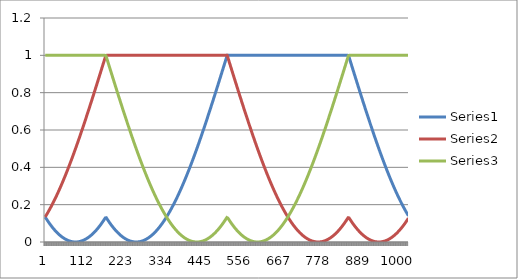
| Category | Series 0 | Series 1 | Series 2 |
|---|---|---|---|
| 0 | 0.134 | 0.134 | 1 |
| 1 | 0.131 | 0.137 | 1 |
| 2 | 0.128 | 0.14 | 1 |
| 3 | 0.125 | 0.143 | 1 |
| 4 | 0.122 | 0.147 | 1 |
| 5 | 0.119 | 0.15 | 1 |
| 6 | 0.116 | 0.153 | 1 |
| 7 | 0.113 | 0.156 | 1 |
| 8 | 0.111 | 0.16 | 1 |
| 9 | 0.108 | 0.163 | 1 |
| 10 | 0.105 | 0.166 | 1 |
| 11 | 0.102 | 0.17 | 1 |
| 12 | 0.1 | 0.173 | 1 |
| 13 | 0.097 | 0.177 | 1 |
| 14 | 0.094 | 0.18 | 1 |
| 15 | 0.092 | 0.184 | 1 |
| 16 | 0.089 | 0.187 | 1 |
| 17 | 0.087 | 0.191 | 1 |
| 18 | 0.084 | 0.194 | 1 |
| 19 | 0.082 | 0.198 | 1 |
| 20 | 0.079 | 0.202 | 1 |
| 21 | 0.077 | 0.205 | 1 |
| 22 | 0.075 | 0.209 | 1 |
| 23 | 0.072 | 0.213 | 1 |
| 24 | 0.07 | 0.217 | 1 |
| 25 | 0.068 | 0.221 | 1 |
| 26 | 0.066 | 0.224 | 1 |
| 27 | 0.063 | 0.228 | 1 |
| 28 | 0.061 | 0.232 | 1 |
| 29 | 0.059 | 0.236 | 1 |
| 30 | 0.057 | 0.24 | 1 |
| 31 | 0.055 | 0.244 | 1 |
| 32 | 0.053 | 0.248 | 1 |
| 33 | 0.051 | 0.252 | 1 |
| 34 | 0.049 | 0.256 | 1 |
| 35 | 0.047 | 0.26 | 1 |
| 36 | 0.045 | 0.265 | 1 |
| 37 | 0.044 | 0.269 | 1 |
| 38 | 0.042 | 0.273 | 1 |
| 39 | 0.04 | 0.277 | 1 |
| 40 | 0.038 | 0.281 | 1 |
| 41 | 0.037 | 0.286 | 1 |
| 42 | 0.035 | 0.29 | 1 |
| 43 | 0.034 | 0.294 | 1 |
| 44 | 0.032 | 0.299 | 1 |
| 45 | 0.03 | 0.303 | 1 |
| 46 | 0.029 | 0.308 | 1 |
| 47 | 0.028 | 0.312 | 1 |
| 48 | 0.026 | 0.316 | 1 |
| 49 | 0.025 | 0.321 | 1 |
| 50 | 0.023 | 0.325 | 1 |
| 51 | 0.022 | 0.33 | 1 |
| 52 | 0.021 | 0.335 | 1 |
| 53 | 0.02 | 0.339 | 1 |
| 54 | 0.018 | 0.344 | 1 |
| 55 | 0.017 | 0.348 | 1 |
| 56 | 0.016 | 0.353 | 1 |
| 57 | 0.015 | 0.358 | 1 |
| 58 | 0.014 | 0.362 | 1 |
| 59 | 0.013 | 0.367 | 1 |
| 60 | 0.012 | 0.372 | 1 |
| 61 | 0.011 | 0.377 | 1 |
| 62 | 0.01 | 0.382 | 1 |
| 63 | 0.009 | 0.386 | 1 |
| 64 | 0.009 | 0.391 | 1 |
| 65 | 0.008 | 0.396 | 1 |
| 66 | 0.007 | 0.401 | 1 |
| 67 | 0.006 | 0.406 | 1 |
| 68 | 0.006 | 0.411 | 1 |
| 69 | 0.005 | 0.416 | 1 |
| 70 | 0.004 | 0.421 | 1 |
| 71 | 0.004 | 0.426 | 1 |
| 72 | 0.003 | 0.431 | 1 |
| 73 | 0.003 | 0.436 | 1 |
| 74 | 0.002 | 0.441 | 1 |
| 75 | 0.002 | 0.446 | 1 |
| 76 | 0.002 | 0.451 | 1 |
| 77 | 0.001 | 0.456 | 1 |
| 78 | 0.001 | 0.462 | 1 |
| 79 | 0.001 | 0.467 | 1 |
| 80 | 0.001 | 0.472 | 1 |
| 81 | 0 | 0.477 | 1 |
| 82 | 0 | 0.482 | 1 |
| 83 | 0 | 0.488 | 1 |
| 84 | 0 | 0.493 | 1 |
| 85 | 0 | 0.498 | 1 |
| 86 | 0 | 0.504 | 1 |
| 87 | 0 | 0.509 | 1 |
| 88 | 0 | 0.514 | 1 |
| 89 | 0 | 0.52 | 1 |
| 90 | 0 | 0.525 | 1 |
| 91 | 0.001 | 0.53 | 1 |
| 92 | 0.001 | 0.536 | 1 |
| 93 | 0.001 | 0.541 | 1 |
| 94 | 0.001 | 0.547 | 1 |
| 95 | 0.002 | 0.552 | 1 |
| 96 | 0.002 | 0.558 | 1 |
| 97 | 0.003 | 0.563 | 1 |
| 98 | 0.003 | 0.569 | 1 |
| 99 | 0.004 | 0.574 | 1 |
| 100 | 0.004 | 0.58 | 1 |
| 101 | 0.005 | 0.585 | 1 |
| 102 | 0.005 | 0.591 | 1 |
| 103 | 0.006 | 0.597 | 1 |
| 104 | 0.007 | 0.602 | 1 |
| 105 | 0.007 | 0.608 | 1 |
| 106 | 0.008 | 0.614 | 1 |
| 107 | 0.009 | 0.619 | 1 |
| 108 | 0.01 | 0.625 | 1 |
| 109 | 0.011 | 0.631 | 1 |
| 110 | 0.011 | 0.636 | 1 |
| 111 | 0.012 | 0.642 | 1 |
| 112 | 0.013 | 0.648 | 1 |
| 113 | 0.014 | 0.654 | 1 |
| 114 | 0.015 | 0.659 | 1 |
| 115 | 0.017 | 0.665 | 1 |
| 116 | 0.018 | 0.671 | 1 |
| 117 | 0.019 | 0.677 | 1 |
| 118 | 0.02 | 0.682 | 1 |
| 119 | 0.021 | 0.688 | 1 |
| 120 | 0.023 | 0.694 | 1 |
| 121 | 0.024 | 0.7 | 1 |
| 122 | 0.025 | 0.706 | 1 |
| 123 | 0.027 | 0.712 | 1 |
| 124 | 0.028 | 0.718 | 1 |
| 125 | 0.03 | 0.723 | 1 |
| 126 | 0.031 | 0.729 | 1 |
| 127 | 0.033 | 0.735 | 1 |
| 128 | 0.034 | 0.741 | 1 |
| 129 | 0.036 | 0.747 | 1 |
| 130 | 0.037 | 0.753 | 1 |
| 131 | 0.039 | 0.759 | 1 |
| 132 | 0.041 | 0.765 | 1 |
| 133 | 0.042 | 0.771 | 1 |
| 134 | 0.044 | 0.777 | 1 |
| 135 | 0.046 | 0.783 | 1 |
| 136 | 0.048 | 0.789 | 1 |
| 137 | 0.05 | 0.795 | 1 |
| 138 | 0.052 | 0.801 | 1 |
| 139 | 0.054 | 0.807 | 1 |
| 140 | 0.056 | 0.813 | 1 |
| 141 | 0.058 | 0.819 | 1 |
| 142 | 0.06 | 0.825 | 1 |
| 143 | 0.062 | 0.831 | 1 |
| 144 | 0.064 | 0.837 | 1 |
| 145 | 0.066 | 0.843 | 1 |
| 146 | 0.069 | 0.849 | 1 |
| 147 | 0.071 | 0.855 | 1 |
| 148 | 0.073 | 0.861 | 1 |
| 149 | 0.075 | 0.867 | 1 |
| 150 | 0.078 | 0.874 | 1 |
| 151 | 0.08 | 0.88 | 1 |
| 152 | 0.083 | 0.886 | 1 |
| 153 | 0.085 | 0.892 | 1 |
| 154 | 0.087 | 0.898 | 1 |
| 155 | 0.09 | 0.904 | 1 |
| 156 | 0.093 | 0.91 | 1 |
| 157 | 0.095 | 0.916 | 1 |
| 158 | 0.098 | 0.922 | 1 |
| 159 | 0.1 | 0.928 | 1 |
| 160 | 0.103 | 0.935 | 1 |
| 161 | 0.106 | 0.941 | 1 |
| 162 | 0.109 | 0.947 | 1 |
| 163 | 0.111 | 0.953 | 1 |
| 164 | 0.114 | 0.959 | 1 |
| 165 | 0.117 | 0.965 | 1 |
| 166 | 0.12 | 0.971 | 1 |
| 167 | 0.123 | 0.978 | 1 |
| 168 | 0.126 | 0.984 | 1 |
| 169 | 0.129 | 0.99 | 1 |
| 170 | 0.132 | 0.996 | 1 |
| 171 | 0.133 | 1 | 0.998 |
| 172 | 0.13 | 1 | 0.992 |
| 173 | 0.127 | 1 | 0.986 |
| 174 | 0.124 | 1 | 0.98 |
| 175 | 0.121 | 1 | 0.973 |
| 176 | 0.118 | 1 | 0.967 |
| 177 | 0.115 | 1 | 0.961 |
| 178 | 0.112 | 1 | 0.955 |
| 179 | 0.11 | 1 | 0.949 |
| 180 | 0.107 | 1 | 0.943 |
| 181 | 0.104 | 1 | 0.937 |
| 182 | 0.101 | 1 | 0.931 |
| 183 | 0.099 | 1 | 0.924 |
| 184 | 0.096 | 1 | 0.918 |
| 185 | 0.093 | 1 | 0.912 |
| 186 | 0.091 | 1 | 0.906 |
| 187 | 0.088 | 1 | 0.9 |
| 188 | 0.086 | 1 | 0.894 |
| 189 | 0.083 | 1 | 0.888 |
| 190 | 0.081 | 1 | 0.882 |
| 191 | 0.079 | 1 | 0.876 |
| 192 | 0.076 | 1 | 0.869 |
| 193 | 0.074 | 1 | 0.863 |
| 194 | 0.072 | 1 | 0.857 |
| 195 | 0.069 | 1 | 0.851 |
| 196 | 0.067 | 1 | 0.845 |
| 197 | 0.065 | 1 | 0.839 |
| 198 | 0.063 | 1 | 0.833 |
| 199 | 0.061 | 1 | 0.827 |
| 200 | 0.058 | 1 | 0.821 |
| 201 | 0.056 | 1 | 0.815 |
| 202 | 0.054 | 1 | 0.809 |
| 203 | 0.052 | 1 | 0.803 |
| 204 | 0.05 | 1 | 0.797 |
| 205 | 0.049 | 1 | 0.791 |
| 206 | 0.047 | 1 | 0.785 |
| 207 | 0.045 | 1 | 0.779 |
| 208 | 0.043 | 1 | 0.773 |
| 209 | 0.041 | 1 | 0.767 |
| 210 | 0.04 | 1 | 0.761 |
| 211 | 0.038 | 1 | 0.755 |
| 212 | 0.036 | 1 | 0.749 |
| 213 | 0.035 | 1 | 0.743 |
| 214 | 0.033 | 1 | 0.737 |
| 215 | 0.032 | 1 | 0.731 |
| 216 | 0.03 | 1 | 0.725 |
| 217 | 0.029 | 1 | 0.72 |
| 218 | 0.027 | 1 | 0.714 |
| 219 | 0.026 | 1 | 0.708 |
| 220 | 0.024 | 1 | 0.702 |
| 221 | 0.023 | 1 | 0.696 |
| 222 | 0.022 | 1 | 0.69 |
| 223 | 0.02 | 1 | 0.684 |
| 224 | 0.019 | 1 | 0.679 |
| 225 | 0.018 | 1 | 0.673 |
| 226 | 0.017 | 1 | 0.667 |
| 227 | 0.016 | 1 | 0.661 |
| 228 | 0.015 | 1 | 0.655 |
| 229 | 0.014 | 1 | 0.65 |
| 230 | 0.013 | 1 | 0.644 |
| 231 | 0.012 | 1 | 0.638 |
| 232 | 0.011 | 1 | 0.632 |
| 233 | 0.01 | 1 | 0.627 |
| 234 | 0.009 | 1 | 0.621 |
| 235 | 0.008 | 1 | 0.615 |
| 236 | 0.008 | 1 | 0.61 |
| 237 | 0.007 | 1 | 0.604 |
| 238 | 0.006 | 1 | 0.599 |
| 239 | 0.005 | 1 | 0.593 |
| 240 | 0.005 | 1 | 0.587 |
| 241 | 0.004 | 1 | 0.582 |
| 242 | 0.004 | 1 | 0.576 |
| 243 | 0.003 | 1 | 0.571 |
| 244 | 0.003 | 1 | 0.565 |
| 245 | 0.002 | 1 | 0.56 |
| 246 | 0.002 | 1 | 0.554 |
| 247 | 0.002 | 1 | 0.549 |
| 248 | 0.001 | 1 | 0.543 |
| 249 | 0.001 | 1 | 0.538 |
| 250 | 0.001 | 1 | 0.532 |
| 251 | 0 | 1 | 0.527 |
| 252 | 0 | 1 | 0.521 |
| 253 | 0 | 1 | 0.516 |
| 254 | 0 | 1 | 0.511 |
| 255 | 0 | 1 | 0.505 |
| 256 | 0 | 1 | 0.5 |
| 257 | 0 | 1 | 0.495 |
| 258 | 0 | 1 | 0.489 |
| 259 | 0 | 1 | 0.484 |
| 260 | 0 | 1 | 0.479 |
| 261 | 0 | 1 | 0.474 |
| 262 | 0.001 | 1 | 0.468 |
| 263 | 0.001 | 1 | 0.463 |
| 264 | 0.001 | 1 | 0.458 |
| 265 | 0.002 | 1 | 0.453 |
| 266 | 0.002 | 1 | 0.448 |
| 267 | 0.002 | 1 | 0.443 |
| 268 | 0.003 | 1 | 0.438 |
| 269 | 0.003 | 1 | 0.433 |
| 270 | 0.004 | 1 | 0.428 |
| 271 | 0.004 | 1 | 0.423 |
| 272 | 0.005 | 1 | 0.418 |
| 273 | 0.005 | 1 | 0.413 |
| 274 | 0.006 | 1 | 0.408 |
| 275 | 0.007 | 1 | 0.403 |
| 276 | 0.008 | 1 | 0.398 |
| 277 | 0.008 | 1 | 0.393 |
| 278 | 0.009 | 1 | 0.388 |
| 279 | 0.01 | 1 | 0.383 |
| 280 | 0.011 | 1 | 0.378 |
| 281 | 0.012 | 1 | 0.374 |
| 282 | 0.013 | 1 | 0.369 |
| 283 | 0.014 | 1 | 0.364 |
| 284 | 0.015 | 1 | 0.359 |
| 285 | 0.016 | 1 | 0.355 |
| 286 | 0.017 | 1 | 0.35 |
| 287 | 0.018 | 1 | 0.345 |
| 288 | 0.019 | 1 | 0.341 |
| 289 | 0.02 | 1 | 0.336 |
| 290 | 0.022 | 1 | 0.331 |
| 291 | 0.023 | 1 | 0.327 |
| 292 | 0.024 | 1 | 0.322 |
| 293 | 0.026 | 1 | 0.318 |
| 294 | 0.027 | 1 | 0.313 |
| 295 | 0.029 | 1 | 0.309 |
| 296 | 0.03 | 1 | 0.305 |
| 297 | 0.032 | 1 | 0.3 |
| 298 | 0.033 | 1 | 0.296 |
| 299 | 0.035 | 1 | 0.291 |
| 300 | 0.036 | 1 | 0.287 |
| 301 | 0.038 | 1 | 0.283 |
| 302 | 0.04 | 1 | 0.279 |
| 303 | 0.041 | 1 | 0.274 |
| 304 | 0.043 | 1 | 0.27 |
| 305 | 0.045 | 1 | 0.266 |
| 306 | 0.047 | 1 | 0.262 |
| 307 | 0.049 | 1 | 0.258 |
| 308 | 0.05 | 1 | 0.254 |
| 309 | 0.052 | 1 | 0.25 |
| 310 | 0.054 | 1 | 0.245 |
| 311 | 0.056 | 1 | 0.241 |
| 312 | 0.058 | 1 | 0.237 |
| 313 | 0.061 | 1 | 0.234 |
| 314 | 0.063 | 1 | 0.23 |
| 315 | 0.065 | 1 | 0.226 |
| 316 | 0.067 | 1 | 0.222 |
| 317 | 0.069 | 1 | 0.218 |
| 318 | 0.072 | 1 | 0.214 |
| 319 | 0.074 | 1 | 0.21 |
| 320 | 0.076 | 1 | 0.207 |
| 321 | 0.079 | 1 | 0.203 |
| 322 | 0.081 | 1 | 0.199 |
| 323 | 0.083 | 1 | 0.196 |
| 324 | 0.086 | 1 | 0.192 |
| 325 | 0.088 | 1 | 0.188 |
| 326 | 0.091 | 1 | 0.185 |
| 327 | 0.093 | 1 | 0.181 |
| 328 | 0.096 | 1 | 0.178 |
| 329 | 0.099 | 1 | 0.174 |
| 330 | 0.101 | 1 | 0.171 |
| 331 | 0.104 | 1 | 0.167 |
| 332 | 0.107 | 1 | 0.164 |
| 333 | 0.11 | 1 | 0.161 |
| 334 | 0.112 | 1 | 0.157 |
| 335 | 0.115 | 1 | 0.154 |
| 336 | 0.118 | 1 | 0.151 |
| 337 | 0.121 | 1 | 0.148 |
| 338 | 0.124 | 1 | 0.144 |
| 339 | 0.127 | 1 | 0.141 |
| 340 | 0.13 | 1 | 0.138 |
| 341 | 0.133 | 1 | 0.135 |
| 342 | 0.136 | 1 | 0.132 |
| 343 | 0.139 | 1 | 0.129 |
| 344 | 0.142 | 1 | 0.126 |
| 345 | 0.145 | 1 | 0.123 |
| 346 | 0.149 | 1 | 0.12 |
| 347 | 0.152 | 1 | 0.117 |
| 348 | 0.155 | 1 | 0.114 |
| 349 | 0.158 | 1 | 0.111 |
| 350 | 0.162 | 1 | 0.109 |
| 351 | 0.165 | 1 | 0.106 |
| 352 | 0.169 | 1 | 0.103 |
| 353 | 0.172 | 1 | 0.1 |
| 354 | 0.175 | 1 | 0.098 |
| 355 | 0.179 | 1 | 0.095 |
| 356 | 0.182 | 1 | 0.093 |
| 357 | 0.186 | 1 | 0.09 |
| 358 | 0.19 | 1 | 0.087 |
| 359 | 0.193 | 1 | 0.085 |
| 360 | 0.197 | 1 | 0.083 |
| 361 | 0.2 | 1 | 0.08 |
| 362 | 0.204 | 1 | 0.078 |
| 363 | 0.208 | 1 | 0.075 |
| 364 | 0.212 | 1 | 0.073 |
| 365 | 0.215 | 1 | 0.071 |
| 366 | 0.219 | 1 | 0.069 |
| 367 | 0.223 | 1 | 0.066 |
| 368 | 0.227 | 1 | 0.064 |
| 369 | 0.231 | 1 | 0.062 |
| 370 | 0.235 | 1 | 0.06 |
| 371 | 0.239 | 1 | 0.058 |
| 372 | 0.243 | 1 | 0.056 |
| 373 | 0.247 | 1 | 0.054 |
| 374 | 0.251 | 1 | 0.052 |
| 375 | 0.255 | 1 | 0.05 |
| 376 | 0.259 | 1 | 0.048 |
| 377 | 0.263 | 1 | 0.046 |
| 378 | 0.267 | 1 | 0.044 |
| 379 | 0.272 | 1 | 0.042 |
| 380 | 0.276 | 1 | 0.041 |
| 381 | 0.28 | 1 | 0.039 |
| 382 | 0.284 | 1 | 0.037 |
| 383 | 0.289 | 1 | 0.036 |
| 384 | 0.293 | 1 | 0.034 |
| 385 | 0.297 | 1 | 0.033 |
| 386 | 0.302 | 1 | 0.031 |
| 387 | 0.306 | 1 | 0.03 |
| 388 | 0.31 | 1 | 0.028 |
| 389 | 0.315 | 1 | 0.027 |
| 390 | 0.319 | 1 | 0.025 |
| 391 | 0.324 | 1 | 0.024 |
| 392 | 0.328 | 1 | 0.023 |
| 393 | 0.333 | 1 | 0.021 |
| 394 | 0.338 | 1 | 0.02 |
| 395 | 0.342 | 1 | 0.019 |
| 396 | 0.347 | 1 | 0.018 |
| 397 | 0.352 | 1 | 0.017 |
| 398 | 0.356 | 1 | 0.015 |
| 399 | 0.361 | 1 | 0.014 |
| 400 | 0.366 | 1 | 0.013 |
| 401 | 0.37 | 1 | 0.012 |
| 402 | 0.375 | 1 | 0.011 |
| 403 | 0.38 | 1 | 0.011 |
| 404 | 0.385 | 1 | 0.01 |
| 405 | 0.39 | 1 | 0.009 |
| 406 | 0.395 | 1 | 0.008 |
| 407 | 0.399 | 1 | 0.007 |
| 408 | 0.404 | 1 | 0.007 |
| 409 | 0.409 | 1 | 0.006 |
| 410 | 0.414 | 1 | 0.005 |
| 411 | 0.419 | 1 | 0.005 |
| 412 | 0.424 | 1 | 0.004 |
| 413 | 0.429 | 1 | 0.004 |
| 414 | 0.434 | 1 | 0.003 |
| 415 | 0.439 | 1 | 0.003 |
| 416 | 0.444 | 1 | 0.002 |
| 417 | 0.45 | 1 | 0.002 |
| 418 | 0.455 | 1 | 0.001 |
| 419 | 0.46 | 1 | 0.001 |
| 420 | 0.465 | 1 | 0.001 |
| 421 | 0.47 | 1 | 0.001 |
| 422 | 0.475 | 1 | 0 |
| 423 | 0.481 | 1 | 0 |
| 424 | 0.486 | 1 | 0 |
| 425 | 0.491 | 1 | 0 |
| 426 | 0.496 | 1 | 0 |
| 427 | 0.502 | 1 | 0 |
| 428 | 0.507 | 1 | 0 |
| 429 | 0.512 | 1 | 0 |
| 430 | 0.518 | 1 | 0 |
| 431 | 0.523 | 1 | 0 |
| 432 | 0.529 | 1 | 0.001 |
| 433 | 0.534 | 1 | 0.001 |
| 434 | 0.539 | 1 | 0.001 |
| 435 | 0.545 | 1 | 0.001 |
| 436 | 0.55 | 1 | 0.002 |
| 437 | 0.556 | 1 | 0.002 |
| 438 | 0.561 | 1 | 0.002 |
| 439 | 0.567 | 1 | 0.003 |
| 440 | 0.572 | 1 | 0.003 |
| 441 | 0.578 | 1 | 0.004 |
| 442 | 0.584 | 1 | 0.004 |
| 443 | 0.589 | 1 | 0.005 |
| 444 | 0.595 | 1 | 0.006 |
| 445 | 0.6 | 1 | 0.006 |
| 446 | 0.606 | 1 | 0.007 |
| 447 | 0.612 | 1 | 0.008 |
| 448 | 0.617 | 1 | 0.009 |
| 449 | 0.623 | 1 | 0.009 |
| 450 | 0.629 | 1 | 0.01 |
| 451 | 0.634 | 1 | 0.011 |
| 452 | 0.64 | 1 | 0.012 |
| 453 | 0.646 | 1 | 0.013 |
| 454 | 0.652 | 1 | 0.014 |
| 455 | 0.657 | 1 | 0.015 |
| 456 | 0.663 | 1 | 0.016 |
| 457 | 0.669 | 1 | 0.017 |
| 458 | 0.675 | 1 | 0.018 |
| 459 | 0.681 | 1 | 0.02 |
| 460 | 0.686 | 1 | 0.021 |
| 461 | 0.692 | 1 | 0.022 |
| 462 | 0.698 | 1 | 0.023 |
| 463 | 0.704 | 1 | 0.025 |
| 464 | 0.71 | 1 | 0.026 |
| 465 | 0.716 | 1 | 0.028 |
| 466 | 0.721 | 1 | 0.029 |
| 467 | 0.727 | 1 | 0.03 |
| 468 | 0.733 | 1 | 0.032 |
| 469 | 0.739 | 1 | 0.034 |
| 470 | 0.745 | 1 | 0.035 |
| 471 | 0.751 | 1 | 0.037 |
| 472 | 0.757 | 1 | 0.038 |
| 473 | 0.763 | 1 | 0.04 |
| 474 | 0.769 | 1 | 0.042 |
| 475 | 0.775 | 1 | 0.044 |
| 476 | 0.781 | 1 | 0.045 |
| 477 | 0.787 | 1 | 0.047 |
| 478 | 0.793 | 1 | 0.049 |
| 479 | 0.799 | 1 | 0.051 |
| 480 | 0.805 | 1 | 0.053 |
| 481 | 0.811 | 1 | 0.055 |
| 482 | 0.817 | 1 | 0.057 |
| 483 | 0.823 | 1 | 0.059 |
| 484 | 0.829 | 1 | 0.061 |
| 485 | 0.835 | 1 | 0.063 |
| 486 | 0.841 | 1 | 0.066 |
| 487 | 0.847 | 1 | 0.068 |
| 488 | 0.853 | 1 | 0.07 |
| 489 | 0.859 | 1 | 0.072 |
| 490 | 0.865 | 1 | 0.075 |
| 491 | 0.872 | 1 | 0.077 |
| 492 | 0.878 | 1 | 0.079 |
| 493 | 0.884 | 1 | 0.082 |
| 494 | 0.89 | 1 | 0.084 |
| 495 | 0.896 | 1 | 0.087 |
| 496 | 0.902 | 1 | 0.089 |
| 497 | 0.908 | 1 | 0.092 |
| 498 | 0.914 | 1 | 0.094 |
| 499 | 0.92 | 1 | 0.097 |
| 500 | 0.926 | 1 | 0.1 |
| 501 | 0.933 | 1 | 0.102 |
| 502 | 0.939 | 1 | 0.105 |
| 503 | 0.945 | 1 | 0.108 |
| 504 | 0.951 | 1 | 0.111 |
| 505 | 0.957 | 1 | 0.113 |
| 506 | 0.963 | 1 | 0.116 |
| 507 | 0.969 | 1 | 0.119 |
| 508 | 0.975 | 1 | 0.122 |
| 509 | 0.982 | 1 | 0.125 |
| 510 | 0.988 | 1 | 0.128 |
| 511 | 0.994 | 1 | 0.131 |
| 512 | 1 | 1 | 0.134 |
| 513 | 1 | 0.994 | 0.131 |
| 514 | 1 | 0.988 | 0.128 |
| 515 | 1 | 0.982 | 0.125 |
| 516 | 1 | 0.975 | 0.122 |
| 517 | 1 | 0.969 | 0.119 |
| 518 | 1 | 0.963 | 0.116 |
| 519 | 1 | 0.957 | 0.113 |
| 520 | 1 | 0.951 | 0.111 |
| 521 | 1 | 0.945 | 0.108 |
| 522 | 1 | 0.939 | 0.105 |
| 523 | 1 | 0.933 | 0.102 |
| 524 | 1 | 0.926 | 0.1 |
| 525 | 1 | 0.92 | 0.097 |
| 526 | 1 | 0.914 | 0.094 |
| 527 | 1 | 0.908 | 0.092 |
| 528 | 1 | 0.902 | 0.089 |
| 529 | 1 | 0.896 | 0.087 |
| 530 | 1 | 0.89 | 0.084 |
| 531 | 1 | 0.884 | 0.082 |
| 532 | 1 | 0.878 | 0.079 |
| 533 | 1 | 0.872 | 0.077 |
| 534 | 1 | 0.865 | 0.075 |
| 535 | 1 | 0.859 | 0.072 |
| 536 | 1 | 0.853 | 0.07 |
| 537 | 1 | 0.847 | 0.068 |
| 538 | 1 | 0.841 | 0.066 |
| 539 | 1 | 0.835 | 0.063 |
| 540 | 1 | 0.829 | 0.061 |
| 541 | 1 | 0.823 | 0.059 |
| 542 | 1 | 0.817 | 0.057 |
| 543 | 1 | 0.811 | 0.055 |
| 544 | 1 | 0.805 | 0.053 |
| 545 | 1 | 0.799 | 0.051 |
| 546 | 1 | 0.793 | 0.049 |
| 547 | 1 | 0.787 | 0.047 |
| 548 | 1 | 0.781 | 0.045 |
| 549 | 1 | 0.775 | 0.044 |
| 550 | 1 | 0.769 | 0.042 |
| 551 | 1 | 0.763 | 0.04 |
| 552 | 1 | 0.757 | 0.038 |
| 553 | 1 | 0.751 | 0.037 |
| 554 | 1 | 0.745 | 0.035 |
| 555 | 1 | 0.739 | 0.034 |
| 556 | 1 | 0.733 | 0.032 |
| 557 | 1 | 0.727 | 0.03 |
| 558 | 1 | 0.721 | 0.029 |
| 559 | 1 | 0.716 | 0.028 |
| 560 | 1 | 0.71 | 0.026 |
| 561 | 1 | 0.704 | 0.025 |
| 562 | 1 | 0.698 | 0.023 |
| 563 | 1 | 0.692 | 0.022 |
| 564 | 1 | 0.686 | 0.021 |
| 565 | 1 | 0.681 | 0.02 |
| 566 | 1 | 0.675 | 0.018 |
| 567 | 1 | 0.669 | 0.017 |
| 568 | 1 | 0.663 | 0.016 |
| 569 | 1 | 0.657 | 0.015 |
| 570 | 1 | 0.652 | 0.014 |
| 571 | 1 | 0.646 | 0.013 |
| 572 | 1 | 0.64 | 0.012 |
| 573 | 1 | 0.634 | 0.011 |
| 574 | 1 | 0.629 | 0.01 |
| 575 | 1 | 0.623 | 0.009 |
| 576 | 1 | 0.617 | 0.009 |
| 577 | 1 | 0.612 | 0.008 |
| 578 | 1 | 0.606 | 0.007 |
| 579 | 1 | 0.6 | 0.006 |
| 580 | 1 | 0.595 | 0.006 |
| 581 | 1 | 0.589 | 0.005 |
| 582 | 1 | 0.584 | 0.004 |
| 583 | 1 | 0.578 | 0.004 |
| 584 | 1 | 0.572 | 0.003 |
| 585 | 1 | 0.567 | 0.003 |
| 586 | 1 | 0.561 | 0.002 |
| 587 | 1 | 0.556 | 0.002 |
| 588 | 1 | 0.55 | 0.002 |
| 589 | 1 | 0.545 | 0.001 |
| 590 | 1 | 0.539 | 0.001 |
| 591 | 1 | 0.534 | 0.001 |
| 592 | 1 | 0.529 | 0.001 |
| 593 | 1 | 0.523 | 0 |
| 594 | 1 | 0.518 | 0 |
| 595 | 1 | 0.512 | 0 |
| 596 | 1 | 0.507 | 0 |
| 597 | 1 | 0.502 | 0 |
| 598 | 1 | 0.496 | 0 |
| 599 | 1 | 0.491 | 0 |
| 600 | 1 | 0.486 | 0 |
| 601 | 1 | 0.481 | 0 |
| 602 | 1 | 0.475 | 0 |
| 603 | 1 | 0.47 | 0.001 |
| 604 | 1 | 0.465 | 0.001 |
| 605 | 1 | 0.46 | 0.001 |
| 606 | 1 | 0.455 | 0.001 |
| 607 | 1 | 0.45 | 0.002 |
| 608 | 1 | 0.444 | 0.002 |
| 609 | 1 | 0.439 | 0.003 |
| 610 | 1 | 0.434 | 0.003 |
| 611 | 1 | 0.429 | 0.004 |
| 612 | 1 | 0.424 | 0.004 |
| 613 | 1 | 0.419 | 0.005 |
| 614 | 1 | 0.414 | 0.005 |
| 615 | 1 | 0.409 | 0.006 |
| 616 | 1 | 0.404 | 0.007 |
| 617 | 1 | 0.399 | 0.007 |
| 618 | 1 | 0.395 | 0.008 |
| 619 | 1 | 0.39 | 0.009 |
| 620 | 1 | 0.385 | 0.01 |
| 621 | 1 | 0.38 | 0.011 |
| 622 | 1 | 0.375 | 0.011 |
| 623 | 1 | 0.37 | 0.012 |
| 624 | 1 | 0.366 | 0.013 |
| 625 | 1 | 0.361 | 0.014 |
| 626 | 1 | 0.356 | 0.015 |
| 627 | 1 | 0.352 | 0.017 |
| 628 | 1 | 0.347 | 0.018 |
| 629 | 1 | 0.342 | 0.019 |
| 630 | 1 | 0.338 | 0.02 |
| 631 | 1 | 0.333 | 0.021 |
| 632 | 1 | 0.328 | 0.023 |
| 633 | 1 | 0.324 | 0.024 |
| 634 | 1 | 0.319 | 0.025 |
| 635 | 1 | 0.315 | 0.027 |
| 636 | 1 | 0.31 | 0.028 |
| 637 | 1 | 0.306 | 0.03 |
| 638 | 1 | 0.302 | 0.031 |
| 639 | 1 | 0.297 | 0.033 |
| 640 | 1 | 0.293 | 0.034 |
| 641 | 1 | 0.289 | 0.036 |
| 642 | 1 | 0.284 | 0.037 |
| 643 | 1 | 0.28 | 0.039 |
| 644 | 1 | 0.276 | 0.041 |
| 645 | 1 | 0.272 | 0.042 |
| 646 | 1 | 0.267 | 0.044 |
| 647 | 1 | 0.263 | 0.046 |
| 648 | 1 | 0.259 | 0.048 |
| 649 | 1 | 0.255 | 0.05 |
| 650 | 1 | 0.251 | 0.052 |
| 651 | 1 | 0.247 | 0.054 |
| 652 | 1 | 0.243 | 0.056 |
| 653 | 1 | 0.239 | 0.058 |
| 654 | 1 | 0.235 | 0.06 |
| 655 | 1 | 0.231 | 0.062 |
| 656 | 1 | 0.227 | 0.064 |
| 657 | 1 | 0.223 | 0.066 |
| 658 | 1 | 0.219 | 0.069 |
| 659 | 1 | 0.215 | 0.071 |
| 660 | 1 | 0.212 | 0.073 |
| 661 | 1 | 0.208 | 0.075 |
| 662 | 1 | 0.204 | 0.078 |
| 663 | 1 | 0.2 | 0.08 |
| 664 | 1 | 0.197 | 0.083 |
| 665 | 1 | 0.193 | 0.085 |
| 666 | 1 | 0.19 | 0.087 |
| 667 | 1 | 0.186 | 0.09 |
| 668 | 1 | 0.182 | 0.093 |
| 669 | 1 | 0.179 | 0.095 |
| 670 | 1 | 0.175 | 0.098 |
| 671 | 1 | 0.172 | 0.1 |
| 672 | 1 | 0.169 | 0.103 |
| 673 | 1 | 0.165 | 0.106 |
| 674 | 1 | 0.162 | 0.109 |
| 675 | 1 | 0.158 | 0.111 |
| 676 | 1 | 0.155 | 0.114 |
| 677 | 1 | 0.152 | 0.117 |
| 678 | 1 | 0.149 | 0.12 |
| 679 | 1 | 0.145 | 0.123 |
| 680 | 1 | 0.142 | 0.126 |
| 681 | 1 | 0.139 | 0.129 |
| 682 | 1 | 0.136 | 0.132 |
| 683 | 1 | 0.133 | 0.135 |
| 684 | 1 | 0.13 | 0.138 |
| 685 | 1 | 0.127 | 0.141 |
| 686 | 1 | 0.124 | 0.144 |
| 687 | 1 | 0.121 | 0.148 |
| 688 | 1 | 0.118 | 0.151 |
| 689 | 1 | 0.115 | 0.154 |
| 690 | 1 | 0.112 | 0.157 |
| 691 | 1 | 0.11 | 0.161 |
| 692 | 1 | 0.107 | 0.164 |
| 693 | 1 | 0.104 | 0.167 |
| 694 | 1 | 0.101 | 0.171 |
| 695 | 1 | 0.099 | 0.174 |
| 696 | 1 | 0.096 | 0.178 |
| 697 | 1 | 0.093 | 0.181 |
| 698 | 1 | 0.091 | 0.185 |
| 699 | 1 | 0.088 | 0.188 |
| 700 | 1 | 0.086 | 0.192 |
| 701 | 1 | 0.083 | 0.196 |
| 702 | 1 | 0.081 | 0.199 |
| 703 | 1 | 0.079 | 0.203 |
| 704 | 1 | 0.076 | 0.207 |
| 705 | 1 | 0.074 | 0.21 |
| 706 | 1 | 0.072 | 0.214 |
| 707 | 1 | 0.069 | 0.218 |
| 708 | 1 | 0.067 | 0.222 |
| 709 | 1 | 0.065 | 0.226 |
| 710 | 1 | 0.063 | 0.23 |
| 711 | 1 | 0.061 | 0.234 |
| 712 | 1 | 0.058 | 0.237 |
| 713 | 1 | 0.056 | 0.241 |
| 714 | 1 | 0.054 | 0.245 |
| 715 | 1 | 0.052 | 0.25 |
| 716 | 1 | 0.05 | 0.254 |
| 717 | 1 | 0.049 | 0.258 |
| 718 | 1 | 0.047 | 0.262 |
| 719 | 1 | 0.045 | 0.266 |
| 720 | 1 | 0.043 | 0.27 |
| 721 | 1 | 0.041 | 0.274 |
| 722 | 1 | 0.04 | 0.279 |
| 723 | 1 | 0.038 | 0.283 |
| 724 | 1 | 0.036 | 0.287 |
| 725 | 1 | 0.035 | 0.291 |
| 726 | 1 | 0.033 | 0.296 |
| 727 | 1 | 0.032 | 0.3 |
| 728 | 1 | 0.03 | 0.305 |
| 729 | 1 | 0.029 | 0.309 |
| 730 | 1 | 0.027 | 0.313 |
| 731 | 1 | 0.026 | 0.318 |
| 732 | 1 | 0.024 | 0.322 |
| 733 | 1 | 0.023 | 0.327 |
| 734 | 1 | 0.022 | 0.331 |
| 735 | 1 | 0.02 | 0.336 |
| 736 | 1 | 0.019 | 0.341 |
| 737 | 1 | 0.018 | 0.345 |
| 738 | 1 | 0.017 | 0.35 |
| 739 | 1 | 0.016 | 0.355 |
| 740 | 1 | 0.015 | 0.359 |
| 741 | 1 | 0.014 | 0.364 |
| 742 | 1 | 0.013 | 0.369 |
| 743 | 1 | 0.012 | 0.374 |
| 744 | 1 | 0.011 | 0.378 |
| 745 | 1 | 0.01 | 0.383 |
| 746 | 1 | 0.009 | 0.388 |
| 747 | 1 | 0.008 | 0.393 |
| 748 | 1 | 0.008 | 0.398 |
| 749 | 1 | 0.007 | 0.403 |
| 750 | 1 | 0.006 | 0.408 |
| 751 | 1 | 0.005 | 0.413 |
| 752 | 1 | 0.005 | 0.418 |
| 753 | 1 | 0.004 | 0.423 |
| 754 | 1 | 0.004 | 0.428 |
| 755 | 1 | 0.003 | 0.433 |
| 756 | 1 | 0.003 | 0.438 |
| 757 | 1 | 0.002 | 0.443 |
| 758 | 1 | 0.002 | 0.448 |
| 759 | 1 | 0.002 | 0.453 |
| 760 | 1 | 0.001 | 0.458 |
| 761 | 1 | 0.001 | 0.463 |
| 762 | 1 | 0.001 | 0.468 |
| 763 | 1 | 0 | 0.474 |
| 764 | 1 | 0 | 0.479 |
| 765 | 1 | 0 | 0.484 |
| 766 | 1 | 0 | 0.489 |
| 767 | 1 | 0 | 0.495 |
| 768 | 1 | 0 | 0.5 |
| 769 | 1 | 0 | 0.505 |
| 770 | 1 | 0 | 0.511 |
| 771 | 1 | 0 | 0.516 |
| 772 | 1 | 0 | 0.521 |
| 773 | 1 | 0 | 0.527 |
| 774 | 1 | 0.001 | 0.532 |
| 775 | 1 | 0.001 | 0.538 |
| 776 | 1 | 0.001 | 0.543 |
| 777 | 1 | 0.002 | 0.549 |
| 778 | 1 | 0.002 | 0.554 |
| 779 | 1 | 0.002 | 0.56 |
| 780 | 1 | 0.003 | 0.565 |
| 781 | 1 | 0.003 | 0.571 |
| 782 | 1 | 0.004 | 0.576 |
| 783 | 1 | 0.004 | 0.582 |
| 784 | 1 | 0.005 | 0.587 |
| 785 | 1 | 0.005 | 0.593 |
| 786 | 1 | 0.006 | 0.599 |
| 787 | 1 | 0.007 | 0.604 |
| 788 | 1 | 0.008 | 0.61 |
| 789 | 1 | 0.008 | 0.615 |
| 790 | 1 | 0.009 | 0.621 |
| 791 | 1 | 0.01 | 0.627 |
| 792 | 1 | 0.011 | 0.632 |
| 793 | 1 | 0.012 | 0.638 |
| 794 | 1 | 0.013 | 0.644 |
| 795 | 1 | 0.014 | 0.65 |
| 796 | 1 | 0.015 | 0.655 |
| 797 | 1 | 0.016 | 0.661 |
| 798 | 1 | 0.017 | 0.667 |
| 799 | 1 | 0.018 | 0.673 |
| 800 | 1 | 0.019 | 0.679 |
| 801 | 1 | 0.02 | 0.684 |
| 802 | 1 | 0.022 | 0.69 |
| 803 | 1 | 0.023 | 0.696 |
| 804 | 1 | 0.024 | 0.702 |
| 805 | 1 | 0.026 | 0.708 |
| 806 | 1 | 0.027 | 0.714 |
| 807 | 1 | 0.029 | 0.72 |
| 808 | 1 | 0.03 | 0.725 |
| 809 | 1 | 0.032 | 0.731 |
| 810 | 1 | 0.033 | 0.737 |
| 811 | 1 | 0.035 | 0.743 |
| 812 | 1 | 0.036 | 0.749 |
| 813 | 1 | 0.038 | 0.755 |
| 814 | 1 | 0.04 | 0.761 |
| 815 | 1 | 0.041 | 0.767 |
| 816 | 1 | 0.043 | 0.773 |
| 817 | 1 | 0.045 | 0.779 |
| 818 | 1 | 0.047 | 0.785 |
| 819 | 1 | 0.049 | 0.791 |
| 820 | 1 | 0.05 | 0.797 |
| 821 | 1 | 0.052 | 0.803 |
| 822 | 1 | 0.054 | 0.809 |
| 823 | 1 | 0.056 | 0.815 |
| 824 | 1 | 0.058 | 0.821 |
| 825 | 1 | 0.061 | 0.827 |
| 826 | 1 | 0.063 | 0.833 |
| 827 | 1 | 0.065 | 0.839 |
| 828 | 1 | 0.067 | 0.845 |
| 829 | 1 | 0.069 | 0.851 |
| 830 | 1 | 0.072 | 0.857 |
| 831 | 1 | 0.074 | 0.863 |
| 832 | 1 | 0.076 | 0.869 |
| 833 | 1 | 0.079 | 0.876 |
| 834 | 1 | 0.081 | 0.882 |
| 835 | 1 | 0.083 | 0.888 |
| 836 | 1 | 0.086 | 0.894 |
| 837 | 1 | 0.088 | 0.9 |
| 838 | 1 | 0.091 | 0.906 |
| 839 | 1 | 0.093 | 0.912 |
| 840 | 1 | 0.096 | 0.918 |
| 841 | 1 | 0.099 | 0.924 |
| 842 | 1 | 0.101 | 0.931 |
| 843 | 1 | 0.104 | 0.937 |
| 844 | 1 | 0.107 | 0.943 |
| 845 | 1 | 0.11 | 0.949 |
| 846 | 1 | 0.112 | 0.955 |
| 847 | 1 | 0.115 | 0.961 |
| 848 | 1 | 0.118 | 0.967 |
| 849 | 1 | 0.121 | 0.973 |
| 850 | 1 | 0.124 | 0.98 |
| 851 | 1 | 0.127 | 0.986 |
| 852 | 1 | 0.13 | 0.992 |
| 853 | 1 | 0.133 | 0.998 |
| 854 | 0.996 | 0.132 | 1 |
| 855 | 0.99 | 0.129 | 1 |
| 856 | 0.984 | 0.126 | 1 |
| 857 | 0.978 | 0.123 | 1 |
| 858 | 0.971 | 0.12 | 1 |
| 859 | 0.965 | 0.117 | 1 |
| 860 | 0.959 | 0.114 | 1 |
| 861 | 0.953 | 0.111 | 1 |
| 862 | 0.947 | 0.109 | 1 |
| 863 | 0.941 | 0.106 | 1 |
| 864 | 0.935 | 0.103 | 1 |
| 865 | 0.928 | 0.1 | 1 |
| 866 | 0.922 | 0.098 | 1 |
| 867 | 0.916 | 0.095 | 1 |
| 868 | 0.91 | 0.093 | 1 |
| 869 | 0.904 | 0.09 | 1 |
| 870 | 0.898 | 0.087 | 1 |
| 871 | 0.892 | 0.085 | 1 |
| 872 | 0.886 | 0.083 | 1 |
| 873 | 0.88 | 0.08 | 1 |
| 874 | 0.874 | 0.078 | 1 |
| 875 | 0.867 | 0.075 | 1 |
| 876 | 0.861 | 0.073 | 1 |
| 877 | 0.855 | 0.071 | 1 |
| 878 | 0.849 | 0.069 | 1 |
| 879 | 0.843 | 0.066 | 1 |
| 880 | 0.837 | 0.064 | 1 |
| 881 | 0.831 | 0.062 | 1 |
| 882 | 0.825 | 0.06 | 1 |
| 883 | 0.819 | 0.058 | 1 |
| 884 | 0.813 | 0.056 | 1 |
| 885 | 0.807 | 0.054 | 1 |
| 886 | 0.801 | 0.052 | 1 |
| 887 | 0.795 | 0.05 | 1 |
| 888 | 0.789 | 0.048 | 1 |
| 889 | 0.783 | 0.046 | 1 |
| 890 | 0.777 | 0.044 | 1 |
| 891 | 0.771 | 0.042 | 1 |
| 892 | 0.765 | 0.041 | 1 |
| 893 | 0.759 | 0.039 | 1 |
| 894 | 0.753 | 0.037 | 1 |
| 895 | 0.747 | 0.036 | 1 |
| 896 | 0.741 | 0.034 | 1 |
| 897 | 0.735 | 0.033 | 1 |
| 898 | 0.729 | 0.031 | 1 |
| 899 | 0.723 | 0.03 | 1 |
| 900 | 0.718 | 0.028 | 1 |
| 901 | 0.712 | 0.027 | 1 |
| 902 | 0.706 | 0.025 | 1 |
| 903 | 0.7 | 0.024 | 1 |
| 904 | 0.694 | 0.023 | 1 |
| 905 | 0.688 | 0.021 | 1 |
| 906 | 0.682 | 0.02 | 1 |
| 907 | 0.677 | 0.019 | 1 |
| 908 | 0.671 | 0.018 | 1 |
| 909 | 0.665 | 0.017 | 1 |
| 910 | 0.659 | 0.015 | 1 |
| 911 | 0.654 | 0.014 | 1 |
| 912 | 0.648 | 0.013 | 1 |
| 913 | 0.642 | 0.012 | 1 |
| 914 | 0.636 | 0.011 | 1 |
| 915 | 0.631 | 0.011 | 1 |
| 916 | 0.625 | 0.01 | 1 |
| 917 | 0.619 | 0.009 | 1 |
| 918 | 0.614 | 0.008 | 1 |
| 919 | 0.608 | 0.007 | 1 |
| 920 | 0.602 | 0.007 | 1 |
| 921 | 0.597 | 0.006 | 1 |
| 922 | 0.591 | 0.005 | 1 |
| 923 | 0.585 | 0.005 | 1 |
| 924 | 0.58 | 0.004 | 1 |
| 925 | 0.574 | 0.004 | 1 |
| 926 | 0.569 | 0.003 | 1 |
| 927 | 0.563 | 0.003 | 1 |
| 928 | 0.558 | 0.002 | 1 |
| 929 | 0.552 | 0.002 | 1 |
| 930 | 0.547 | 0.001 | 1 |
| 931 | 0.541 | 0.001 | 1 |
| 932 | 0.536 | 0.001 | 1 |
| 933 | 0.53 | 0.001 | 1 |
| 934 | 0.525 | 0 | 1 |
| 935 | 0.52 | 0 | 1 |
| 936 | 0.514 | 0 | 1 |
| 937 | 0.509 | 0 | 1 |
| 938 | 0.504 | 0 | 1 |
| 939 | 0.498 | 0 | 1 |
| 940 | 0.493 | 0 | 1 |
| 941 | 0.488 | 0 | 1 |
| 942 | 0.482 | 0 | 1 |
| 943 | 0.477 | 0 | 1 |
| 944 | 0.472 | 0.001 | 1 |
| 945 | 0.467 | 0.001 | 1 |
| 946 | 0.462 | 0.001 | 1 |
| 947 | 0.456 | 0.001 | 1 |
| 948 | 0.451 | 0.002 | 1 |
| 949 | 0.446 | 0.002 | 1 |
| 950 | 0.441 | 0.002 | 1 |
| 951 | 0.436 | 0.003 | 1 |
| 952 | 0.431 | 0.003 | 1 |
| 953 | 0.426 | 0.004 | 1 |
| 954 | 0.421 | 0.004 | 1 |
| 955 | 0.416 | 0.005 | 1 |
| 956 | 0.411 | 0.006 | 1 |
| 957 | 0.406 | 0.006 | 1 |
| 958 | 0.401 | 0.007 | 1 |
| 959 | 0.396 | 0.008 | 1 |
| 960 | 0.391 | 0.009 | 1 |
| 961 | 0.386 | 0.009 | 1 |
| 962 | 0.382 | 0.01 | 1 |
| 963 | 0.377 | 0.011 | 1 |
| 964 | 0.372 | 0.012 | 1 |
| 965 | 0.367 | 0.013 | 1 |
| 966 | 0.362 | 0.014 | 1 |
| 967 | 0.358 | 0.015 | 1 |
| 968 | 0.353 | 0.016 | 1 |
| 969 | 0.348 | 0.017 | 1 |
| 970 | 0.344 | 0.018 | 1 |
| 971 | 0.339 | 0.02 | 1 |
| 972 | 0.335 | 0.021 | 1 |
| 973 | 0.33 | 0.022 | 1 |
| 974 | 0.325 | 0.023 | 1 |
| 975 | 0.321 | 0.025 | 1 |
| 976 | 0.316 | 0.026 | 1 |
| 977 | 0.312 | 0.028 | 1 |
| 978 | 0.308 | 0.029 | 1 |
| 979 | 0.303 | 0.03 | 1 |
| 980 | 0.299 | 0.032 | 1 |
| 981 | 0.294 | 0.034 | 1 |
| 982 | 0.29 | 0.035 | 1 |
| 983 | 0.286 | 0.037 | 1 |
| 984 | 0.281 | 0.038 | 1 |
| 985 | 0.277 | 0.04 | 1 |
| 986 | 0.273 | 0.042 | 1 |
| 987 | 0.269 | 0.044 | 1 |
| 988 | 0.265 | 0.045 | 1 |
| 989 | 0.26 | 0.047 | 1 |
| 990 | 0.256 | 0.049 | 1 |
| 991 | 0.252 | 0.051 | 1 |
| 992 | 0.248 | 0.053 | 1 |
| 993 | 0.244 | 0.055 | 1 |
| 994 | 0.24 | 0.057 | 1 |
| 995 | 0.236 | 0.059 | 1 |
| 996 | 0.232 | 0.061 | 1 |
| 997 | 0.228 | 0.063 | 1 |
| 998 | 0.224 | 0.066 | 1 |
| 999 | 0.221 | 0.068 | 1 |
| 1000 | 0.217 | 0.07 | 1 |
| 1001 | 0.213 | 0.072 | 1 |
| 1002 | 0.209 | 0.075 | 1 |
| 1003 | 0.205 | 0.077 | 1 |
| 1004 | 0.202 | 0.079 | 1 |
| 1005 | 0.198 | 0.082 | 1 |
| 1006 | 0.194 | 0.084 | 1 |
| 1007 | 0.191 | 0.087 | 1 |
| 1008 | 0.187 | 0.089 | 1 |
| 1009 | 0.184 | 0.092 | 1 |
| 1010 | 0.18 | 0.094 | 1 |
| 1011 | 0.177 | 0.097 | 1 |
| 1012 | 0.173 | 0.1 | 1 |
| 1013 | 0.17 | 0.102 | 1 |
| 1014 | 0.166 | 0.105 | 1 |
| 1015 | 0.163 | 0.108 | 1 |
| 1016 | 0.16 | 0.111 | 1 |
| 1017 | 0.156 | 0.113 | 1 |
| 1018 | 0.153 | 0.116 | 1 |
| 1019 | 0.15 | 0.119 | 1 |
| 1020 | 0.147 | 0.122 | 1 |
| 1021 | 0.143 | 0.125 | 1 |
| 1022 | 0.14 | 0.128 | 1 |
| 1023 | 0.137 | 0.131 | 1 |